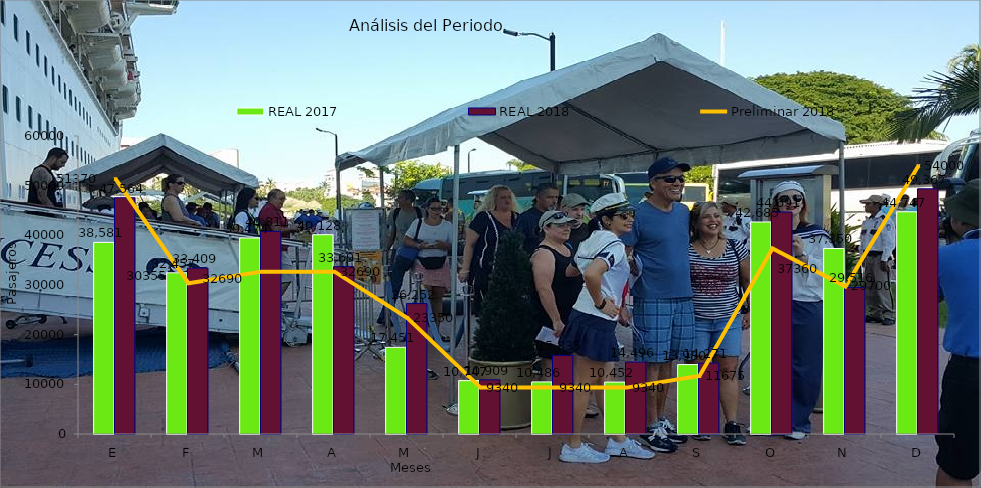
| Category | REAL 2017 | REAL 2018 |
|---|---|---|
| E | 38581 | 47564 |
| F | 32457 | 33409 |
| M | 39474 | 40811 |
| A | 40128 | 33691 |
| M | 17451 | 26252 |
| J | 10747 | 10909 |
| J | 10486 | 15835 |
| A | 10452 | 14496 |
| S | 13980 | 14271 |
| O | 42685 | 44691 |
| N | 37350 | 29516 |
| D | 44747 | 49367 |